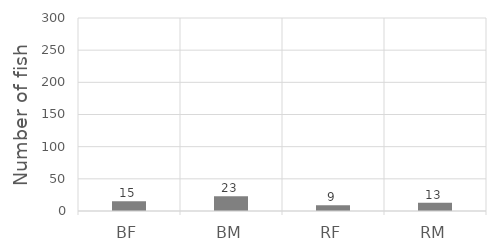
| Category | Series 0 |
|---|---|
| BF | 15 |
| BM | 23 |
| RF | 9 |
| RM | 13 |